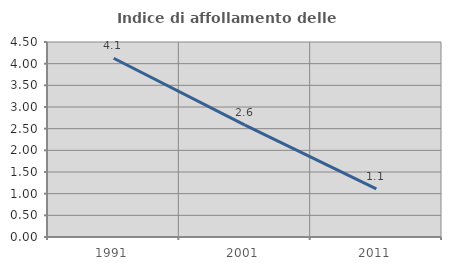
| Category | Indice di affollamento delle abitazioni  |
|---|---|
| 1991.0 | 4.125 |
| 2001.0 | 2.583 |
| 2011.0 | 1.111 |